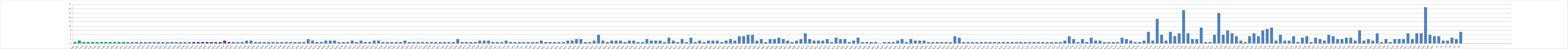
| Category | Series 0 |
|---|---|
| A.W1 | 1 |
| A.W2 | 2 |
| A.W3 | 1 |
| A.W4 | 1 |
| A.W5 | 1 |
| A.W6 | 1 |
| A.W7 | 1 |
| A.W8 | 1 |
| A.W9 | 1 |
| A.W10 | 1 |
| A.W11 | 1 |
| A.W12 | 1 |
| A.W13 | 1 |
| A.W14 | 1 |
| A.W15 | 1 |
| A.W16 | 1 |
| A.W17 | 1 |
| A.W18 | 1 |
| A.W19 | 1 |
| A.W20 | 1 |
| A.W21 | 1 |
| A.W22 | 1 |
| A.W23 | 1 |
| A.W24 | 1 |
| A.W25 | 1 |
| A.W26 | 1 |
| A.W27 | 1 |
| A.W28 | 1 |
| A.W29 | 1 |
| A.W30 | 1 |
| A.W31 | 1 |
| A.W32 | 1 |
| A.W33 | 1 |
| A.W34 | 1 |
| A.W35 | 2 |
| A.W36 | 1 |
| A.W37 | 1 |
| A.W38 | 1 |
| A.W39 | 1 |
| A.W40 | 2 |
| A.W41 | 2 |
| A.W42 | 1 |
| A.W43 | 1 |
| A.W44 | 1 |
| A.W45 | 1 |
| A.W46 | 1 |
| A.W47 | 1 |
| A.W48 | 1 |
| A.W49 | 1 |
| A.W50 | 1 |
| A.W51 | 1 |
| A.W52 | 1 |
| A.W53 | 1 |
| B.W1 | 3 |
| B.W2 | 2 |
| B.W3 | 1 |
| B.W4 | 1 |
| B.W5 | 2 |
| B.W6 | 2 |
| B.W7 | 2 |
| B.W8 | 1 |
| B.W9 | 1 |
| B.W10 | 1 |
| B.W11 | 2 |
| B.W12 | 1 |
| B.W13 | 2 |
| B.W14 | 1 |
| B.W15 | 1 |
| B.W16 | 2 |
| B.W17 | 2 |
| B.W18 | 1 |
| B.W19 | 1 |
| B.W20 | 1 |
| B.W21 | 1 |
| B.W22 | 1 |
| B.W23 | 2 |
| B.W24 | 1 |
| B.W25 | 1 |
| B.W26 | 1 |
| B.W27 | 1 |
| B.W28 | 1 |
| B.W29 | 1 |
| B.W30 | 1 |
| B.W31 | 1 |
| B.W32 | 1 |
| B.W33 | 1 |
| B.W34 | 1 |
| B.W35 | 3 |
| B.W36 | 1 |
| B.W37 | 1 |
| B.W38 | 1 |
| B.W39 | 1 |
| B.W40 | 2 |
| B.W41 | 2 |
| B.W42 | 2 |
| B.W43 | 1 |
| C.W1 | 1 |
| C.W2 | 1 |
| C.W3 | 2 |
| C.W4 | 1 |
| C.W5 | 1 |
| C.W6 | 1 |
| C.W7 | 1 |
| C.W8 | 1 |
| C.W9 | 1 |
| C.W10 | 1 |
| C.W11 | 2 |
| C.W12 | 1 |
| C.W13 | 1 |
| C.W14 | 1 |
| C.W15 | 1 |
| C.W16 | 1 |
| C.W17 | 2 |
| C.W18 | 2 |
| C.W19 | 3 |
| C.W20 | 3 |
| C.W21 | 1 |
| C.W22 | 1 |
| C.W23 | 2 |
| C.W24 | 6 |
| C.W25 | 2 |
| C.W26 | 1 |
| C.W27 | 2 |
| C.W28 | 2 |
| C.W29 | 2 |
| C.W30 | 1 |
| C.W31 | 2 |
| C.W32 | 2 |
| C.W33 | 1 |
| C.W34 | 1 |
| C.W35 | 3 |
| C.W36 | 2 |
| C.W37 | 2 |
| C.W38 | 2 |
| C.W39 | 1 |
| C.W40 | 4 |
| C.W41 | 2 |
| C.W42 | 1 |
| C.W43 | 3 |
| C.W44 | 1 |
| C.W45 | 4 |
| C.W46 | 1 |
| C.W47 | 2 |
| C.W48 | 1 |
| C.W49 | 2 |
| C.W50 | 2 |
| C.W51 | 2 |
| C.W52 | 1 |
| C.W53 | 2 |
| C.W54 | 3 |
| C.W55 | 2 |
| C.W56 | 5 |
| C.W57 | 5 |
| C.W58 | 6 |
| C.W59 | 6 |
| C.W60 | 2 |
| C.W61 | 3 |
| C.W62 | 1 |
| C.W63 | 3 |
| C.W64 | 3 |
| C.W65 | 4 |
| C.W66 | 3 |
| C.W67 | 2 |
| C.W68 | 1 |
| C.W69 | 2 |
| C.W70 | 3 |
| C.W71 | 7 |
| C.W72 | 3 |
| C.W73 | 2 |
| C.W74 | 2 |
| C.W75 | 2 |
| C.W76 | 3 |
| C.W77 | 1 |
| C.W78 | 4 |
| C.W79 | 3 |
| C.W80 | 3 |
| C.W81 | 1 |
| C.W82 | 2 |
| C.W83 | 4 |
| C.W84 | 1 |
| C.W85 | 1 |
| C.W86 | 1 |
| C.W87 | 1 |
| C.W88 | 0 |
| C.W89 | 1 |
| C.W90 | 1 |
| C.W91 | 1 |
| C.W92 | 2 |
| C.W93 | 3 |
| C.W94 | 1 |
| C.W95 | 3 |
| C.W96 | 2 |
| C.W97 | 2 |
| C.W98 | 2 |
| C.W99 | 1 |
| C.W100 | 1 |
| C.W101 | 1 |
| C.W102 | 1 |
| C.W103 | 1 |
| C.W104 | 1 |
| C.W105 | 5 |
| C.W106 | 4 |
| C.W107 | 1 |
| C.W108 | 1 |
| A.U1 | 1 |
| A.U2 | 1 |
| A.U3 | 1 |
| A.U4 | 1 |
| A.U5 | 1 |
| A.U6 | 1 |
| A.U7 | 1 |
| A.U8 | 1 |
| A.U9 | 1 |
| A.U10 | 1 |
| A.U11 | 1 |
| A.U12 | 1 |
| A.U13 | 1 |
| A.U14 | 1 |
| A.U15 | 1 |
| A.U16 | 1 |
| A.U17 | 1 |
| A.U18 | 1 |
| A.U19 | 1 |
| B.U1 | 1 |
| B.U2 | 1 |
| B.U3 | 2 |
| B.U4 | 5 |
| B.U5 | 3 |
| B.U6 | 1 |
| B.U7 | 3 |
| B.U8 | 1 |
| B.U9 | 4 |
| B.U10 | 2 |
| B.U11 | 2 |
| B.U12 | 1 |
| B.U13 | 1 |
| B.U14 | 1 |
| B.U15 | 1 |
| B.U16 | 4 |
| B.U17 | 3 |
| B.U18 | 2 |
| B.U19 | 1 |
| B.U20 | 1 |
| C.U1 | 2 |
| C.U2 | 8 |
| C.U3 | 2 |
| C.U4 | 17 |
| C.U5 | 6 |
| C.U6 | 2 |
| C.U7 | 8 |
| C.U8 | 5 |
| C.U9 | 7 |
| C.U10 | 23 |
| C.U11 | 7 |
| C.U12 | 3 |
| C.U13 | 3 |
| C.U14 | 11 |
| C.U15 | 1 |
| C.U16 | 1 |
| C.U17 | 6 |
| C.U18 | 21 |
| C.U19 | 6 |
| C.U20 | 9 |
| C.U21 | 7 |
| C.U22 | 5 |
| C.U23 | 2 |
| C.U24 | 1 |
| C.U25 | 5 |
| C.U26 | 7 |
| C.U27 | 5 |
| C.U28 | 9 |
| C.U29 | 10 |
| C.U30 | 11 |
| C.U31 | 2 |
| C.U32 | 6 |
| C.U33 | 2 |
| C.U34 | 2 |
| C.U35 | 5 |
| C.U36 | 1 |
| C.U37 | 4 |
| C.U38 | 5 |
| C.U39 | 1 |
| C.U40 | 4 |
| C.U41 | 3 |
| C.U42 | 2 |
| C.U43 | 6 |
| C.U44 | 5 |
| C.U45 | 3 |
| C.U46 | 3 |
| C.U47 | 4 |
| C.U48 | 4 |
| C.U49 | 2 |
| C.U50 | 9 |
| C.U51 | 2 |
| C.U52 | 3 |
| C.U53 | 2 |
| C.U54 | 7 |
| C.U55 | 1 |
| C.U56 | 3 |
| C.U57 | 1 |
| C.U58 | 3 |
| C.U59 | 3 |
| C.U60 | 3 |
| C.U61 | 7 |
| C.U62 | 3 |
| C.U63 | 7 |
| C.U64 | 7 |
| C.U65 | 25 |
| C.U66 | 6 |
| C.U67 | 5 |
| K1 | 5 |
| K2 | 2 |
| K3 | 2 |
| K4 | 4 |
| K5 | 3 |
| K6 | 8 |